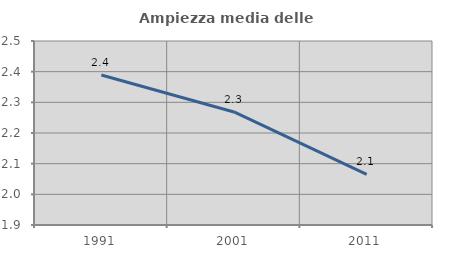
| Category | Ampiezza media delle famiglie |
|---|---|
| 1991.0 | 2.389 |
| 2001.0 | 2.269 |
| 2011.0 | 2.065 |